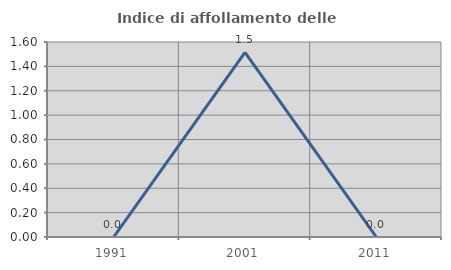
| Category | Indice di affollamento delle abitazioni  |
|---|---|
| 1991.0 | 0 |
| 2001.0 | 1.515 |
| 2011.0 | 0 |